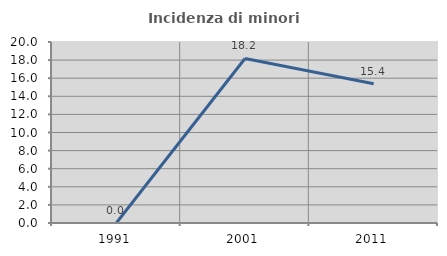
| Category | Incidenza di minori stranieri |
|---|---|
| 1991.0 | 0 |
| 2001.0 | 18.182 |
| 2011.0 | 15.385 |